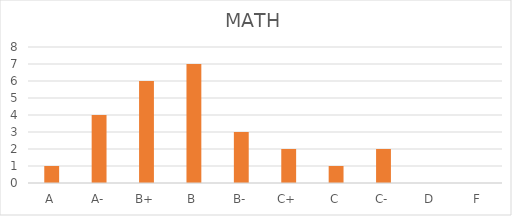
| Category | MATH |
|---|---|
| A | 1 |
| A- | 4 |
| B+ | 6 |
| B | 7 |
| B- | 3 |
| C+ | 2 |
| C | 1 |
| C- | 2 |
| D | 0 |
| F | 0 |